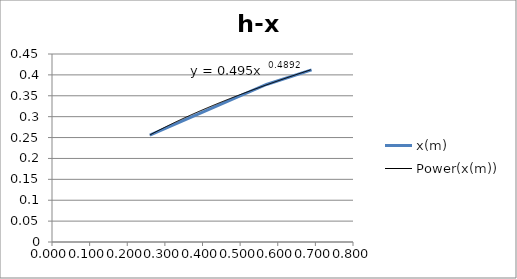
| Category | x(m) |
|---|---|
| 0.26 | 0.256 |
| 0.57 | 0.377 |
| 0.69 | 0.412 |